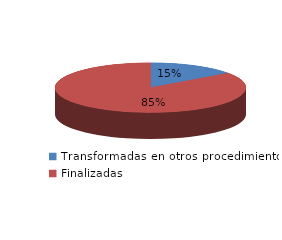
| Category | Series 0 |
|---|---|
| Transformadas en otros procedimientos | 2736 |
| Finalizadas | 15759 |